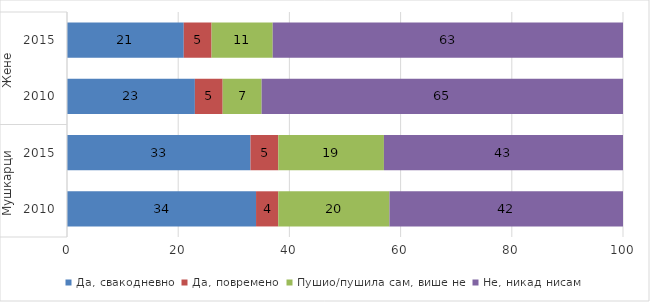
| Category | Да, свакодневно | Да, повремено | Пушио/пушила сам, више не | Не, никад нисам |
|---|---|---|---|---|
| 0 | 34 | 4 | 20 | 42 |
| 1 | 33 | 5 | 19 | 43 |
| 2 | 23 | 5 | 7 | 65 |
| 3 | 21 | 5 | 11 | 63 |